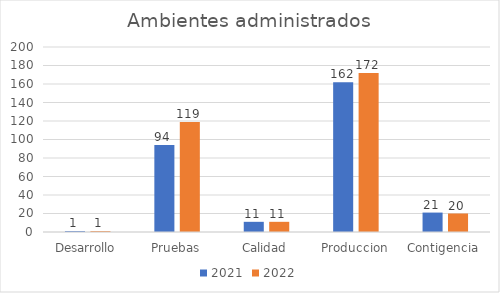
| Category | 2021 | 2022 |
|---|---|---|
| Desarrollo | 1 | 1 |
| Pruebas | 94 | 119 |
| Calidad | 11 | 11 |
| Produccion | 162 | 172 |
| Contigencia | 21 | 20 |